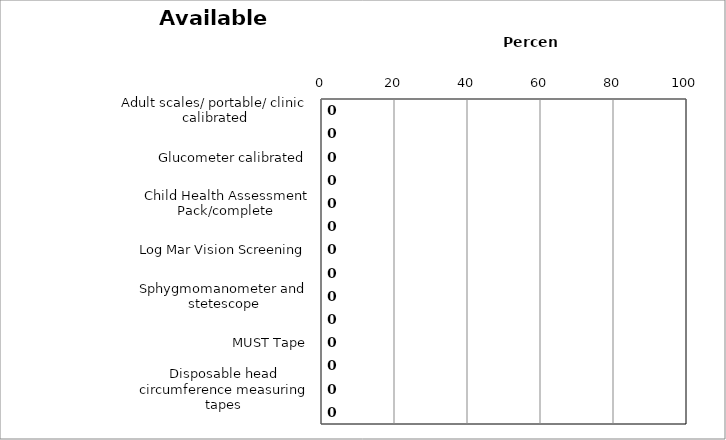
| Category | Series 0 |
|---|---|
| Adult scales/ portable/ clinic calibrated | 0 |
| Baby Scales calibrated | 0 |
| Glucometer calibrated | 0 |
| Access to Defibrillator (AED) | 0 |
| Child Health Assessment Pack/complete | 0 |
| Height Measure (Leicester) | 0 |
| Log Mar Vision Screening | 0 |
| Seca Measuring mat | 0 |
| Sphygmomanometer and stetescope | 0 |
| Doppler equipment {if trained} | 0 |
| MUST Tape | 0 |
| Child Health Development Training Manual | 0 |
| Disposable head circumference measuring tapes | 0 |
| Thermometer calibrated | 0 |